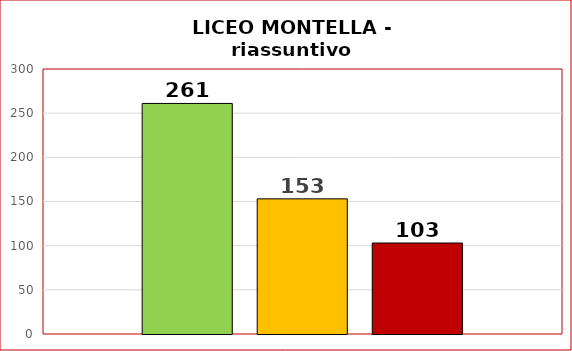
| Category | SUPERATI | PARZIAL.NTE SUPERATI | NON SUPERATI |
|---|---|---|---|
| 0 | 261 | 153 | 103 |